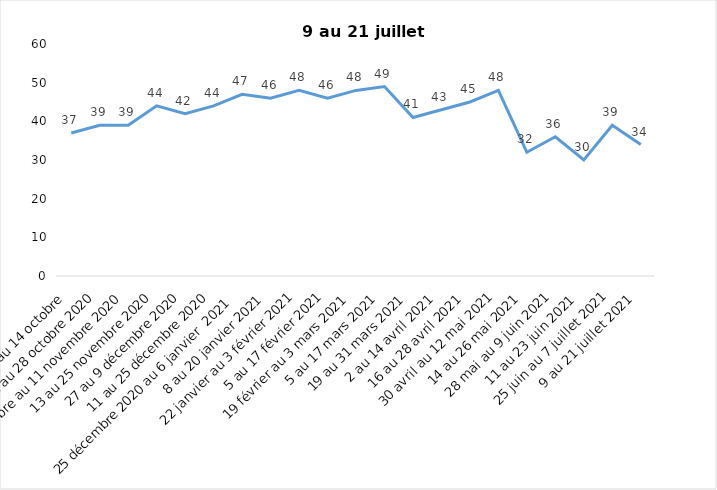
| Category | Toujours aux trois mesures |
|---|---|
| 2 au 14 octobre  | 37 |
| 16 au 28 octobre 2020 | 39 |
| 30 octobre au 11 novembre 2020 | 39 |
| 13 au 25 novembre 2020 | 44 |
| 27 au 9 décembre 2020 | 42 |
| 11 au 25 décembre 2020 | 44 |
| 25 décembre 2020 au 6 janvier  2021 | 47 |
| 8 au 20 janvier 2021 | 46 |
| 22 janvier au 3 février 2021 | 48 |
| 5 au 17 février 2021 | 46 |
| 19 février au 3 mars 2021 | 48 |
| 5 au 17 mars 2021 | 49 |
| 19 au 31 mars 2021 | 41 |
| 2 au 14 avril 2021 | 43 |
| 16 au 28 avril 2021 | 45 |
| 30 avril au 12 mai 2021 | 48 |
| 14 au 26 mai 2021 | 32 |
| 28 mai au 9 juin 2021 | 36 |
| 11 au 23 juin 2021 | 30 |
| 25 juin au 7 juillet 2021 | 39 |
| 9 au 21 juillet 2021 | 34 |